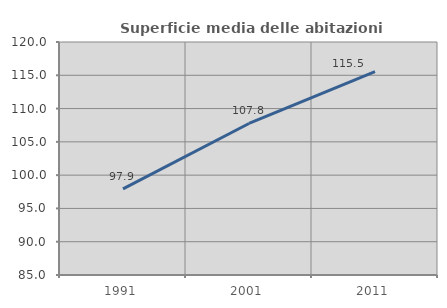
| Category | Superficie media delle abitazioni occupate |
|---|---|
| 1991.0 | 97.941 |
| 2001.0 | 107.764 |
| 2011.0 | 115.545 |